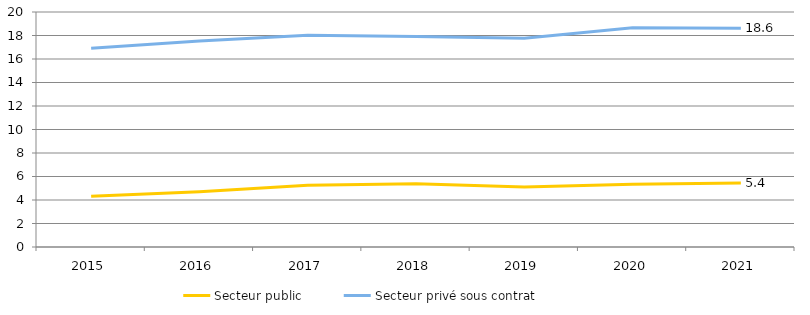
| Category | Secteur public | Secteur privé sous contrat |
|---|---|---|
| 2015.0 | 4.312 | 16.921 |
| 2016.0 | 4.697 | 17.522 |
| 2017.0 | 5.257 | 18.028 |
| 2018.0 | 5.376 | 17.925 |
| 2019.0 | 5.11 | 17.771 |
| 2020.0 | 5.332 | 18.666 |
| 2021.0 | 5.442 | 18.61 |